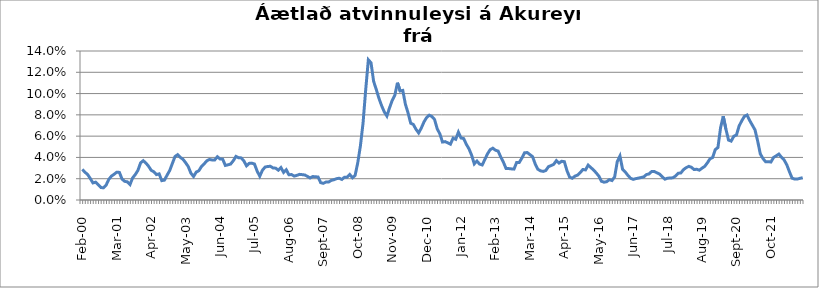
| Category | Series 0 |
|---|---|
| Feb-00 | 0.029 |
| Mar-00 | 0.026 |
| Apr-00 | 0.024 |
| May-00 | 0.02 |
| Jun-00 | 0.016 |
| Jul-00 | 0.017 |
| Aug-00 | 0.014 |
| Sep-00 | 0.012 |
| Oct-00 | 0.011 |
| Nov-00 | 0.014 |
| Dec-00 | 0.019 |
| Jan-01 | 0.022 |
| Feb-01 | 0.024 |
| Mar-01 | 0.026 |
| Apr-01 | 0.026 |
| May-01 | 0.02 |
| Jun-01 | 0.018 |
| Jul-01 | 0.017 |
| Aug-01 | 0.014 |
| Sep-01 | 0.021 |
| Oct-01 | 0.024 |
| Nov-01 | 0.028 |
| Dec-01 | 0.035 |
| Jan-02 | 0.037 |
| Feb-02 | 0.035 |
| Mar-02 | 0.032 |
| Apr-02 | 0.028 |
| May-02 | 0.027 |
| Jun-02 | 0.024 |
| Jul-02 | 0.025 |
| Aug-02 | 0.018 |
| Sep-02 | 0.019 |
| Oct-02 | 0.023 |
| Nov-02 | 0.028 |
| Dec-02 | 0.034 |
| Jan-03 | 0.041 |
| Feb-03 | 0.043 |
| Mar-03 | 0.04 |
| Apr-03 | 0.038 |
| May-03 | 0.035 |
| Jun-03 | 0.031 |
| Jul-03 | 0.025 |
| Aug-03 | 0.022 |
| Sep-03 | 0.026 |
| Oct-03 | 0.028 |
| Nov-03 | 0.032 |
| Dec-03 | 0.034 |
| Jan-04 | 0.037 |
| Feb-04 | 0.038 |
| Mar-04 | 0.038 |
| Apr-04 | 0.038 |
| May-04 | 0.041 |
| Jun-04 | 0.039 |
| Jul-04 | 0.038 |
| Aug-04 | 0.032 |
| Sep-04 | 0.033 |
| Oct-04 | 0.034 |
| Nov-04 | 0.037 |
| Dec-04 | 0.041 |
| Jan-05 | 0.04 |
| Feb-05 | 0.04 |
| Mar-05 | 0.037 |
| Apr-05 | 0.032 |
| May-05 | 0.034 |
| Jun-05 | 0.035 |
| Jul-05 | 0.034 |
| Aug-05 | 0.027 |
| Sep-05 | 0.022 |
| Oct-05 | 0.028 |
| Nov-05 | 0.031 |
| Dec-05 | 0.031 |
| Jan-06 | 0.032 |
| Feb-06 | 0.03 |
| Mar-06 | 0.03 |
| Apr-06 | 0.028 |
| May-06 | 0.03 |
| Jun-06 | 0.026 |
| Jul-06 | 0.028 |
| Aug-06 | 0.024 |
| Sep-06 | 0.024 |
| Oct-06 | 0.022 |
| Nov-06 | 0.023 |
| Dec-06 | 0.024 |
| Jan-07 | 0.024 |
| Feb-07 | 0.024 |
| Mar-07 | 0.022 |
| Apr-07 | 0.021 |
| May-07 | 0.022 |
| Jun-07 | 0.022 |
| Jul-07 | 0.022 |
| Aug-07 | 0.016 |
| Sep-07 | 0.016 |
| Oct-07 | 0.017 |
| Nov-07 | 0.017 |
| Dec-07 | 0.018 |
| Jan-08 | 0.019 |
| Feb-08 | 0.02 |
| Mar-08 | 0.02 |
| Apr-08 | 0.019 |
| May-08 | 0.021 |
| Jun-08 | 0.021 |
| Jul-08 | 0.024 |
| Aug-08 | 0.021 |
| Sep-08 | 0.023 |
| Oct-08 | 0.035 |
| Nov-08 | 0.051 |
| Dec-08 | 0.072 |
| Jan-09 | 0.104 |
| Feb-09 | 0.132 |
| Mar-09 | 0.129 |
| Apr-09 | 0.111 |
| May-09 | 0.104 |
| Jun-09 | 0.096 |
| Jul-09 | 0.089 |
| Aug-09 | 0.083 |
| Sep-09 | 0.079 |
| Oct-09 | 0.087 |
| Nov-09 | 0.094 |
| Dec-09 | 0.098 |
| Jan-10 | 0.11 |
| Feb-10 | 0.102 |
| Mar-10 | 0.103 |
| Apr-10 | 0.09 |
| May-10 | 0.082 |
| Jun-10 | 0.072 |
| Jul-10 | 0.071 |
| Aug-10 | 0.066 |
| Sep-10 | 0.063 |
| Oct-10 | 0.068 |
| Nov-10 | 0.073 |
| Dec-10 | 0.077 |
| Jan-11 | 0.08 |
| Feb-11 | 0.078 |
| Mar-11 | 0.076 |
| Apr-11 | 0.067 |
| May-11 | 0.062 |
| Jun-11 | 0.054 |
| Jul-11 | 0.055 |
| Aug-11 | 0.054 |
| Sep-11 | 0.052 |
| Oct-11 | 0.058 |
| Nov-11 | 0.057 |
| Dec-11 | 0.064 |
| Jan-12 | 0.058 |
| Feb-12 | 0.058 |
| Mar-12 | 0.052 |
| Apr-12 | 0.048 |
| May-12 | 0.042 |
| Jun-12 | 0.034 |
| Jul-12 | 0.037 |
| Aug-12 | 0.034 |
| Sep-12 | 0.033 |
| Oct-12 | 0.038 |
| Nov-12 | 0.043 |
| Dec-12 | 0.047 |
| Jan-13 | 0.049 |
| Feb-13 | 0.047 |
| Mar-13 | 0.046 |
| Apr-13 | 0.04 |
| May-13 | 0.036 |
| Jun-13 | 0.03 |
| Jul-13 | 0.03 |
| Aug-13 | 0.029 |
| Sep-13 | 0.029 |
| Oct-13 | 0.035 |
| Nov-13 | 0.035 |
| Dec-13 | 0.039 |
| Jan-14 | 0.044 |
| Feb-14 | 0.045 |
| Mar-14 | 0.043 |
| Apr-14 | 0.041 |
| May-14 | 0.034 |
| Jun-14 | 0.029 |
| Jul-14 | 0.027 |
| Aug-14 | 0.027 |
| Sep-14 | 0.028 |
| Oct-14 | 0.031 |
| Nov-14 | 0.032 |
| Dec-14 | 0.034 |
| Jan-15 | 0.037 |
| Feb-15 | 0.035 |
| Mar-15 | 0.036 |
| Apr-15 | 0.036 |
| May-15 | 0.028 |
| Jun-15 | 0.021 |
| Jul-15 | 0.02 |
| Aug-15 | 0.022 |
| Sep-15 | 0.023 |
| Oct-15 | 0.026 |
| Nov-15 | 0.029 |
| Dec-15 | 0.028 |
| Jan-16 | 0.033 |
| Feb-16 | 0.03 |
| Mar-16 | 0.028 |
| Apr-16 | 0.026 |
| May-16 | 0.023 |
| Jun-16 | 0.018 |
| Jul-16 | 0.017 |
| Aug-16 | 0.017 |
| Sep-16 | 0.019 |
| Oct-16 | 0.018 |
| Nov-16 | 0.022 |
| Dec-16 | 0.036 |
| Jan-17 | 0.041 |
| Feb-17 | 0.029 |
| Mar-17 | 0.026 |
| Apr-17 | 0.023 |
| May-17 | 0.02 |
| Jun-17 | 0.019 |
| Jul-17 | 0.02 |
| Aug-17 | 0.021 |
| Sep-17 | 0.021 |
| Oct-17 | 0.022 |
| Nov-17 | 0.024 |
| Dec-17 | 0.024 |
| Jan-18 | 0.027 |
| Feb-18 | 0.027 |
| Mar-18 | 0.025 |
| Apr-18 | 0.024 |
| May-18 | 0.022 |
| Jun-18 | 0.02 |
| Jul-18 | 0.021 |
| Aug-18 | 0.021 |
| Sep-18 | 0.021 |
| Oct-18 | 0.023 |
| Nov-18 | 0.025 |
| Dec-18 | 0.025 |
| Jan-19 | 0.029 |
| Feb-19 | 0.03 |
| Mar-19 | 0.032 |
| Apr-19 | 0.031 |
| May-19 | 0.029 |
| Jun-19 | 0.029 |
| Jul-19 | 0.028 |
| Aug-19 | 0.03 |
| Sep-19 | 0.032 |
| Oct-19 | 0.035 |
| Nov-19 | 0.039 |
| Dec-19 | 0.04 |
| Jan-20 | 0.047 |
| Feb-20 | 0.049 |
| mars 2020*** | 0.068 |
| Apr-20 | 0.079 |
| May-20 | 0.067 |
| Jun-20 | 0.056 |
| Jul-20 | 0.055 |
| Aug-20 | 0.06 |
| Sep-20 | 0.061 |
| Oct-20 | 0.07 |
| Nov-20 | 0.074 |
| Dec-20 | 0.079 |
| Jan-21 | 0.08 |
| Feb-21 | 0.075 |
| Mar-21 | 0.07 |
| Apr-21 | 0.066 |
| May-21 | 0.055 |
| Jun-21 | 0.043 |
| Jul-21 | 0.039 |
| Aug-21 | 0.036 |
| Sep-21 | 0.036 |
| Oct-21 | 0.036 |
| Nov-21 | 0.04 |
| Dec-21 | 0.042 |
| Jan-22 | 0.043 |
| Feb-22 | 0.04 |
| Mar-22 | 0.038 |
| Apr-22 | 0.033 |
| May-22 | 0.027 |
| Jun-22 | 0.021 |
| Jul-22 | 0.02 |
| Aug-22 | 0.02 |
| Sep-22 | 0.02 |
| Oct-22 | 0.021 |